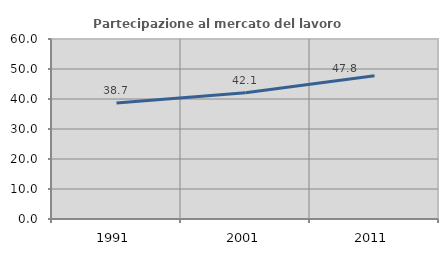
| Category | Partecipazione al mercato del lavoro  femminile |
|---|---|
| 1991.0 | 38.672 |
| 2001.0 | 42.101 |
| 2011.0 | 47.757 |